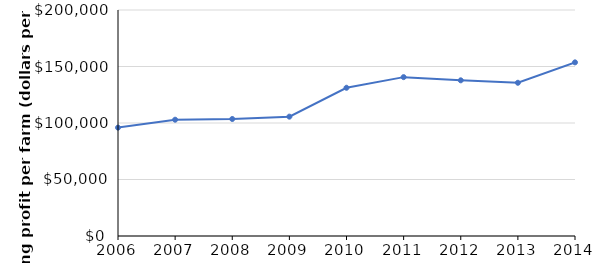
| Category | Series 0 |
|---|---|
| 2006.0 | 95898.849 |
| 2007.0 | 102896.53 |
| 2008.0 | 103547.193 |
| 2009.0 | 105622.506 |
| 2010.0 | 131190.319 |
| 2011.0 | 140586.882 |
| 2012.0 | 137769.889 |
| 2013.0 | 135597.864 |
| 2014.0 | 153661.409 |